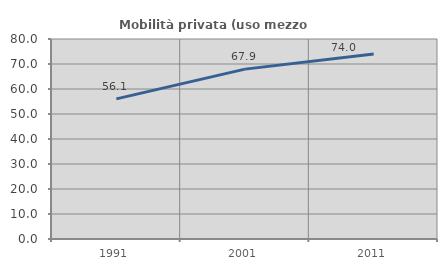
| Category | Mobilità privata (uso mezzo privato) |
|---|---|
| 1991.0 | 56.055 |
| 2001.0 | 67.949 |
| 2011.0 | 73.961 |